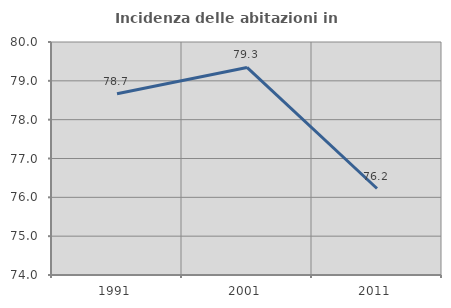
| Category | Incidenza delle abitazioni in proprietà  |
|---|---|
| 1991.0 | 78.665 |
| 2001.0 | 79.345 |
| 2011.0 | 76.227 |